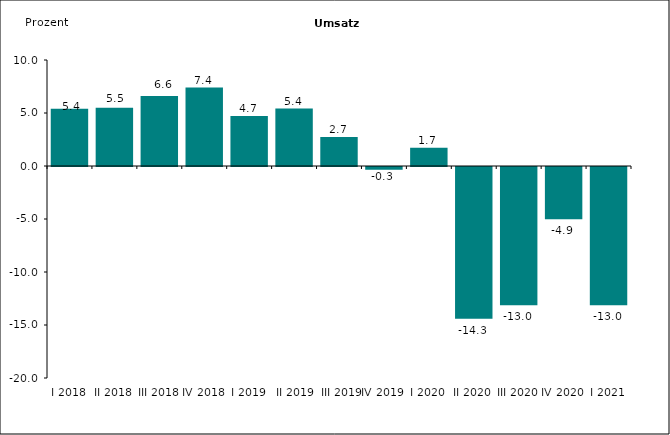
| Category | Series 0 |
|---|---|
| I 2018 | 5.4 |
| II 2018 | 5.5 |
| III 2018 | 6.6 |
| IV 2018 | 7.4 |
| I 2019 | 4.714 |
|  II 2019 | 5.422 |
|  III 2019 | 2.73 |
| IV 2019 | -0.265 |
| I 2020 | 1.721 |
| II 2020 | -14.324 |
| III 2020 | -13.033 |
| IV 2020 | -4.938 |
| I 2021 | -13.038 |